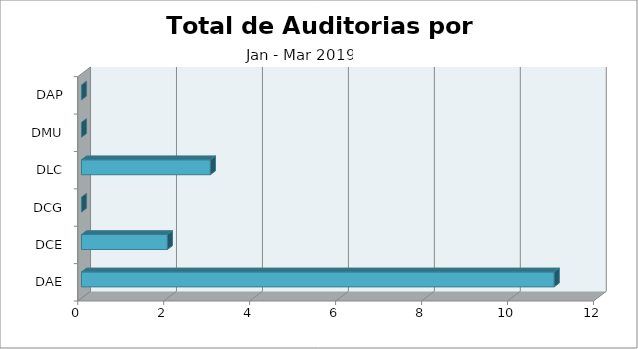
| Category | TOTAL |
|---|---|
| DAE | 11 |
| DCE | 2 |
| DCG | 0 |
| DLC | 3 |
| DMU | 0 |
| DAP | 0 |